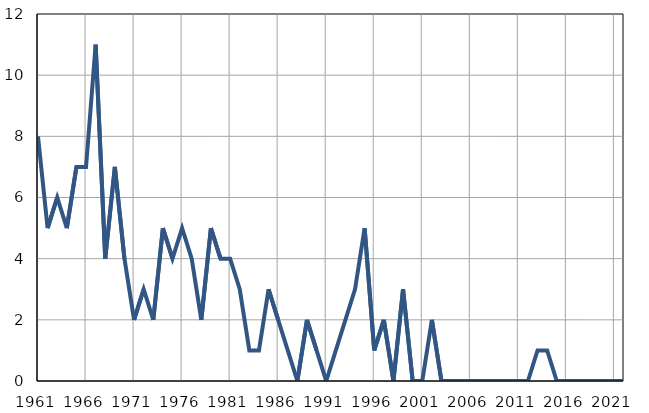
| Category | Infants
deaths |
|---|---|
| 1961.0 | 8 |
| 1962.0 | 5 |
| 1963.0 | 6 |
| 1964.0 | 5 |
| 1965.0 | 7 |
| 1966.0 | 7 |
| 1967.0 | 11 |
| 1968.0 | 4 |
| 1969.0 | 7 |
| 1970.0 | 4 |
| 1971.0 | 2 |
| 1972.0 | 3 |
| 1973.0 | 2 |
| 1974.0 | 5 |
| 1975.0 | 4 |
| 1976.0 | 5 |
| 1977.0 | 4 |
| 1978.0 | 2 |
| 1979.0 | 5 |
| 1980.0 | 4 |
| 1981.0 | 4 |
| 1982.0 | 3 |
| 1983.0 | 1 |
| 1984.0 | 1 |
| 1985.0 | 3 |
| 1986.0 | 2 |
| 1987.0 | 1 |
| 1988.0 | 0 |
| 1989.0 | 2 |
| 1990.0 | 1 |
| 1991.0 | 0 |
| 1992.0 | 1 |
| 1993.0 | 2 |
| 1994.0 | 3 |
| 1995.0 | 5 |
| 1996.0 | 1 |
| 1997.0 | 2 |
| 1998.0 | 0 |
| 1999.0 | 3 |
| 2000.0 | 0 |
| 2001.0 | 0 |
| 2002.0 | 2 |
| 2003.0 | 0 |
| 2004.0 | 0 |
| 2005.0 | 0 |
| 2006.0 | 0 |
| 2007.0 | 0 |
| 2008.0 | 0 |
| 2009.0 | 0 |
| 2010.0 | 0 |
| 2011.0 | 0 |
| 2012.0 | 0 |
| 2013.0 | 1 |
| 2014.0 | 1 |
| 2015.0 | 0 |
| 2016.0 | 0 |
| 2017.0 | 0 |
| 2018.0 | 0 |
| 2019.0 | 0 |
| 2020.0 | 0 |
| 2021.0 | 0 |
| 2022.0 | 0 |